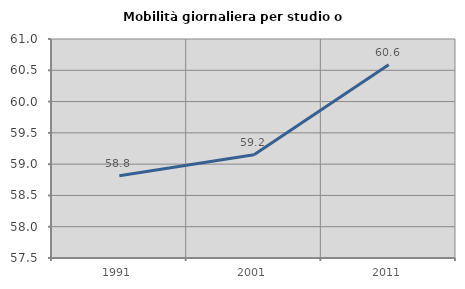
| Category | Mobilità giornaliera per studio o lavoro |
|---|---|
| 1991.0 | 58.814 |
| 2001.0 | 59.151 |
| 2011.0 | 60.589 |